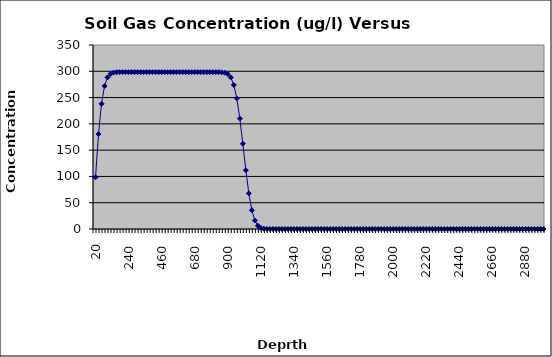
| Category | Series 0 |
|---|---|
| 20.0 | 98.358 |
| 40.0 | 180.637 |
| 60.0 | 238.214 |
| 80.0 | 271.916 |
| 100.0 | 288.417 |
| 120.0 | 295.174 |
| 140.0 | 297.488 |
| 160.0 | 298.15 |
| 180.0 | 298.309 |
| 200.0 | 298.341 |
| 220.0 | 298.346 |
| 240.0 | 298.347 |
| 260.0 | 298.347 |
| 280.0 | 298.347 |
| 300.0 | 298.347 |
| 320.0 | 298.347 |
| 340.0 | 298.347 |
| 360.0 | 298.347 |
| 380.0 | 298.347 |
| 400.0 | 298.347 |
| 420.0 | 298.347 |
| 440.0 | 298.347 |
| 460.0 | 298.347 |
| 480.0 | 298.347 |
| 500.0 | 298.347 |
| 520.0 | 298.347 |
| 540.0 | 298.347 |
| 560.0 | 298.347 |
| 580.0 | 298.347 |
| 600.0 | 298.347 |
| 620.0 | 298.347 |
| 640.0 | 298.347 |
| 660.0 | 298.347 |
| 680.0 | 298.347 |
| 700.0 | 298.347 |
| 720.0 | 298.347 |
| 740.0 | 298.347 |
| 760.0 | 298.347 |
| 780.0 | 298.347 |
| 800.0 | 298.345 |
| 820.0 | 298.336 |
| 840.0 | 298.286 |
| 860.0 | 298.065 |
| 880.0 | 297.244 |
| 900.0 | 294.703 |
| 920.0 | 288.137 |
| 940.0 | 273.976 |
| 960.0 | 248.485 |
| 980.0 | 210.18 |
| 1000.0 | 162.132 |
| 1020.0 | 111.822 |
| 1040.0 | 67.848 |
| 1060.0 | 35.763 |
| 1080.0 | 16.221 |
| 1100.0 | 6.286 |
| 1120.0 | 2.07 |
| 1140.0 | 0.577 |
| 1160.0 | 0.136 |
| 1180.0 | 0.027 |
| 1200.0 | 0.004 |
| 1220.0 | 0.001 |
| 1240.0 | 0 |
| 1260.0 | 0 |
| 1280.0 | 0 |
| 1300.0 | 0 |
| 1320.0 | 0 |
| 1340.0 | 0 |
| 1360.0 | 0 |
| 1380.0 | 0 |
| 1400.0 | 0 |
| 1420.0 | 0 |
| 1440.0 | 0 |
| 1460.0 | 0 |
| 1480.0 | 0 |
| 1500.0 | 0 |
| 1520.0 | 0 |
| 1540.0 | 0 |
| 1560.0 | 0 |
| 1580.0 | 0 |
| 1600.0 | 0 |
| 1620.0 | 0 |
| 1640.0 | 0 |
| 1660.0 | 0 |
| 1680.0 | 0 |
| 1700.0 | 0 |
| 1720.0 | 0 |
| 1740.0 | 0 |
| 1760.0 | 0 |
| 1780.0 | 0 |
| 1800.0 | 0 |
| 1820.0 | 0 |
| 1840.0 | 0 |
| 1860.0 | 0 |
| 1880.0 | 0 |
| 1900.0 | 0 |
| 1920.0 | 0 |
| 1940.0 | 0 |
| 1960.0 | 0 |
| 1980.0 | 0 |
| 2000.0 | 0 |
| 2020.0 | 0 |
| 2040.0 | 0 |
| 2060.0 | 0 |
| 2080.0 | 0 |
| 2100.0 | 0 |
| 2120.0 | 0 |
| 2140.0 | 0 |
| 2160.0 | 0 |
| 2180.0 | 0 |
| 2200.0 | 0 |
| 2220.0 | 0 |
| 2240.0 | 0 |
| 2260.0 | 0 |
| 2280.0 | 0 |
| 2300.0 | 0 |
| 2320.0 | 0 |
| 2340.0 | 0 |
| 2360.0 | 0 |
| 2380.0 | 0 |
| 2400.0 | 0 |
| 2420.0 | 0 |
| 2440.0 | 0 |
| 2460.0 | 0 |
| 2480.0 | 0 |
| 2500.0 | 0 |
| 2520.0 | 0 |
| 2540.0 | 0 |
| 2560.0 | 0 |
| 2580.0 | 0 |
| 2600.0 | 0 |
| 2620.0 | 0 |
| 2640.0 | 0 |
| 2660.0 | 0 |
| 2680.0 | 0 |
| 2700.0 | 0 |
| 2720.0 | 0 |
| 2740.0 | 0 |
| 2760.0 | 0 |
| 2780.0 | 0 |
| 2800.0 | 0 |
| 2820.0 | 0 |
| 2840.0 | 0 |
| 2860.0 | 0 |
| 2880.0 | 0 |
| 2900.0 | 0 |
| 2920.0 | 0 |
| 2940.0 | 0 |
| 2960.0 | 0 |
| 2980.0 | 0 |
| 3000.0 | 0 |